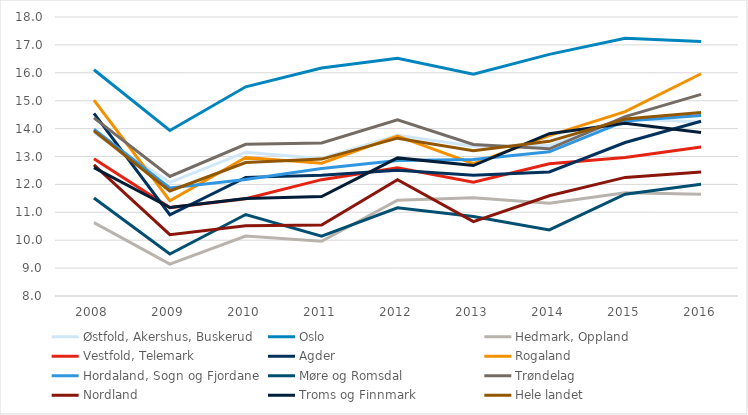
| Category | Østfold, Akershus, Buskerud | Oslo | Hedmark, Oppland | Vestfold, Telemark | Agder | Rogaland | Hordaland, Sogn og Fjordane | Møre og Romsdal | Trøndelag | Nordland | Troms og Finnmark | Hele landet |
|---|---|---|---|---|---|---|---|---|---|---|---|---|
| 2008.0 | 13.852 | 16.108 | 10.63 | 12.922 | 14.547 | 15.018 | 13.977 | 11.515 | 14.382 | 12.702 | 12.603 | 13.918 |
| 2009.0 | 12.076 | 13.933 | 9.142 | 11.169 | 10.912 | 11.414 | 11.87 | 9.504 | 12.284 | 10.2 | 11.17 | 11.764 |
| 2010.0 | 13.154 | 15.498 | 10.147 | 11.484 | 12.252 | 12.963 | 12.176 | 10.92 | 13.439 | 10.514 | 11.494 | 12.785 |
| 2011.0 | 12.933 | 16.174 | 9.963 | 12.17 | 12.332 | 12.761 | 12.566 | 10.143 | 13.483 | 10.545 | 11.563 | 12.907 |
| 2012.0 | 13.763 | 16.517 | 11.435 | 12.593 | 12.509 | 13.729 | 12.859 | 11.163 | 14.311 | 12.167 | 12.95 | 13.657 |
| 2013.0 | 13.368 | 15.948 | 11.525 | 12.075 | 12.327 | 12.747 | 12.89 | 10.852 | 13.431 | 10.667 | 12.675 | 13.205 |
| 2014.0 | 13.392 | 16.659 | 11.321 | 12.74 | 12.445 | 13.746 | 13.168 | 10.37 | 13.276 | 11.595 | 13.816 | 13.544 |
| 2015.0 | 14.342 | 17.239 | 11.701 | 12.961 | 13.502 | 14.606 | 14.273 | 11.648 | 14.428 | 12.251 | 14.192 | 14.345 |
| 2016.0 | 14.238 | 17.119 | 11.644 | 13.344 | 14.265 | 15.965 | 14.471 | 12.003 | 15.225 | 12.445 | 13.859 | 14.578 |